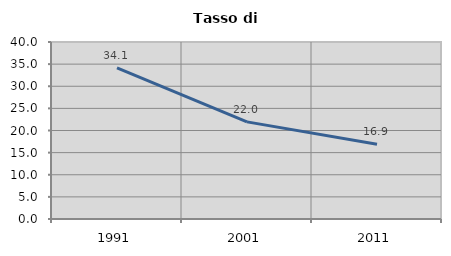
| Category | Tasso di disoccupazione   |
|---|---|
| 1991.0 | 34.146 |
| 2001.0 | 21.951 |
| 2011.0 | 16.892 |